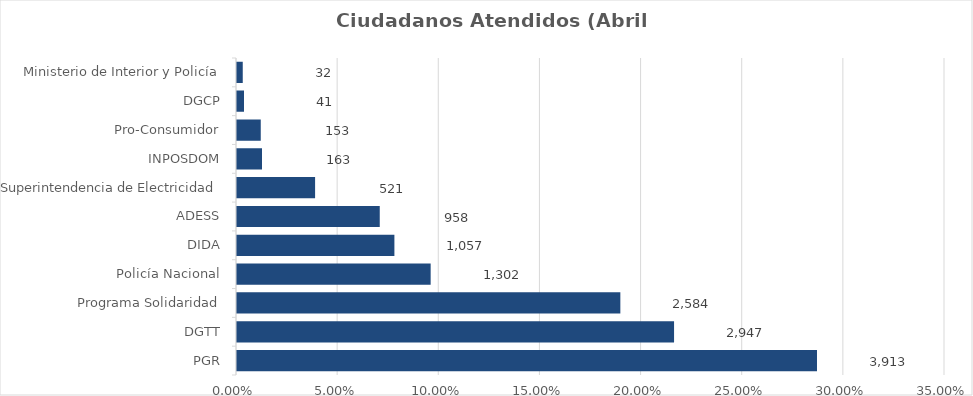
| Category | Porcentaje |
|---|---|
| PGR | 0.286 |
| DGTT | 0.216 |
| Programa Solidaridad | 0.189 |
| Policía Nacional | 0.095 |
| DIDA | 0.077 |
| ADESS | 0.07 |
| Superintendencia de Electricidad | 0.038 |
| INPOSDOM | 0.012 |
| Pro-Consumidor | 0.011 |
| DGCP | 0.003 |
| Ministerio de Interior y Policía | 0.002 |